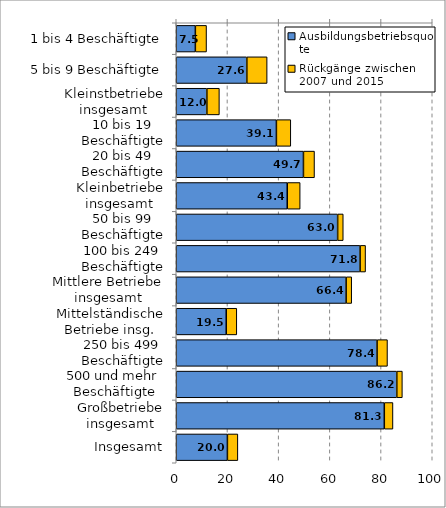
| Category | Ausbildungsbetriebsquote | Rückgänge zwischen 2007 und 2015 |
|---|---|---|
| 1 bis 4 Beschäftigte | 7.459 | 4.373 |
| 5 bis 9 Beschäftigte | 27.571 | 7.929 |
| Kleinstbetriebe insgesamt | 11.958 | 4.889 |
| 10 bis 19 Beschäftigte | 39.12 | 5.629 |
| 20 bis 49 Beschäftigte | 49.684 | 4.324 |
| Kleinbetriebe insgesamt | 43.359 | 5.048 |
| 50 bis 99 Beschäftigte | 63.047 | 2.188 |
| 100 bis 249 Beschäftigte | 71.816 | 2.139 |
| Mittlere Betriebe insgesamt | 66.359 | 2.182 |
| Mittelständische Betriebe insg. | 19.531 | 4.124 |
| 250 bis 499 Beschäftigte | 78.448 | 4.06 |
| 500 und mehr  Beschäftigte | 86.156 | 2.167 |
| Großbetriebe insgesamt | 81.274 | 3.381 |
| Insgesamt | 19.979 | 4.088 |